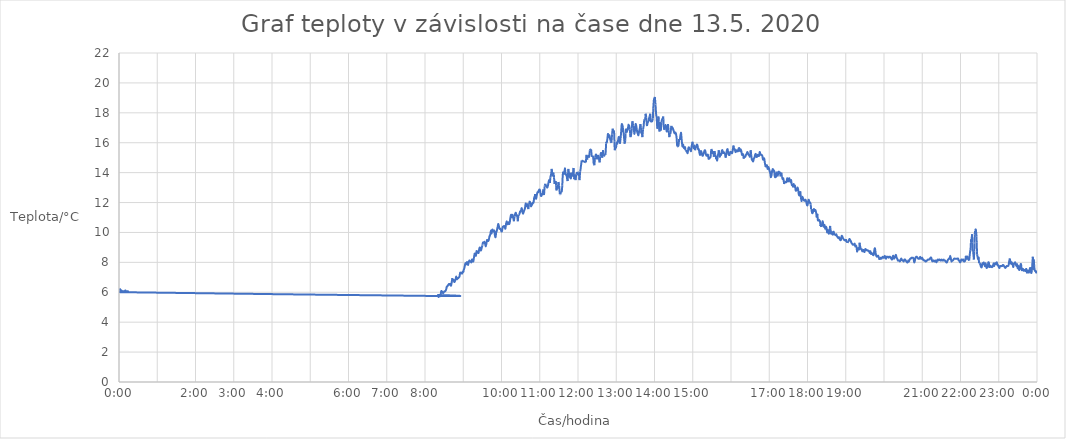
| Category | teplota/cas |
|---|---|
| 43964.00053240741 | 6.25 |
| 43964.001238425924 | 6.188 |
| 43964.00195601852 | 6.125 |
| 43964.00266203703 | 6.125 |
| 43964.00337962963 | 6.062 |
| 43964.00409722222 | 6.062 |
| 43964.00480324074 | 6.062 |
| 43964.005520833336 | 6.062 |
| 43964.00622685185 | 6.062 |
| 43964.006944444445 | 6.125 |
| 43964.00766203704 | 6 |
| 43964.008368055554 | 6.062 |
| 43964.00908564815 | 6.062 |
| 43964.009791666664 | 6.062 |
| 43964.01050925926 | 6 |
| 43964.346666666665 | 5.75 |
| 43964.34738425926 | 5.812 |
| 43964.34809027778 | 5.688 |
| 43964.348807870374 | 5.75 |
| 43964.34952546296 | 5.812 |
| 43964.35023148148 | 5.75 |
| 43964.350949074076 | 6.062 |
| 43964.35165509259 | 6.062 |
| 43964.352372685185 | 6 |
| 43964.3530787037 | 5.938 |
| 43964.353796296295 | 6 |
| 43964.35451388889 | 6.062 |
| 43964.355219907404 | 6.062 |
| 43964.3559375 | 6.125 |
| 43964.35664351852 | 6.25 |
| 43964.356990740744 | 6.375 |
| 43964.35737268518 | 6.375 |
| 43964.358090277776 | 6.438 |
| 43964.3587962963 | 6.5 |
| 43964.35951388889 | 6.562 |
| 43964.36021990741 | 6.5 |
| 43964.3609375 | 6.562 |
| 43964.361655092594 | 6.438 |
| 43964.36236111111 | 6.625 |
| 43964.363078703704 | 6.938 |
| 43964.36309027778 | 6.875 |
| 43964.36380787037 | 6.875 |
| 43964.36451388889 | 6.812 |
| 43964.36523148148 | 6.688 |
| 43964.3659375 | 6.75 |
| 43964.36665509259 | 6.875 |
| 43964.36736111111 | 7.062 |
| 43964.3680787037 | 6.875 |
| 43964.368796296294 | 6.938 |
| 43964.36950231482 | 6.938 |
| 43964.37021990741 | 7 |
| 43964.37092592593 | 7.062 |
| 43964.37164351852 | 7.312 |
| 43964.372349537036 | 7.25 |
| 43964.37306712963 | 7.312 |
| 43964.37378472222 | 7.25 |
| 43964.37449074074 | 7.375 |
| 43964.37520833333 | 7.375 |
| 43964.37547453704 | 7.5 |
| 43964.3759375 | 7.562 |
| 43964.37664351852 | 7.75 |
| 43964.37736111111 | 7.938 |
| 43964.378067129626 | 7.938 |
| 43964.37878472222 | 7.875 |
| 43964.37938657407 | 8.062 |
| 43964.37951388889 | 8 |
| 43964.380219907405 | 7.812 |
| 43964.3809375 | 8 |
| 43964.38164351852 | 8.125 |
| 43964.382361111115 | 8.062 |
| 43964.38306712963 | 8.062 |
| 43964.383784722224 | 8 |
| 43964.38450231482 | 8.188 |
| 43964.38520833333 | 8.125 |
| 43964.385925925926 | 8.062 |
| 43964.38663194444 | 8.312 |
| 43964.387349537035 | 8.562 |
| 43964.38741898148 | 8.625 |
| 43964.388078703705 | 8.625 |
| 43964.38878472222 | 8.438 |
| 43964.389502314814 | 8.75 |
| 43964.39020833333 | 8.688 |
| 43964.39092592592 | 8.688 |
| 43964.39163194445 | 8.625 |
| 43964.39234953704 | 8.875 |
| 43964.393055555556 | 9 |
| 43964.39377314815 | 8.812 |
| 43964.394479166665 | 8.812 |
| 43964.39519675926 | 9 |
| 43964.39591435185 | 9.125 |
| 43964.39592592593 | 9.188 |
| 43964.396631944444 | 9.375 |
| 43964.39734953704 | 9.312 |
| 43964.39805555555 | 9.375 |
| 43964.39877314815 | 9.25 |
| 43964.39949074074 | 9.062 |
| 43964.400196759256 | 9.25 |
| 43964.40091435185 | 9.5 |
| 43964.40162037037 | 9.438 |
| 43964.402337962965 | 9.438 |
| 43964.40304398148 | 9.562 |
| 43964.40354166667 | 9.75 |
| 43964.40377314815 | 9.75 |
| 43964.404490740744 | 9.875 |
| 43964.40519675926 | 10.125 |
| 43964.40591435185 | 9.938 |
| 43964.40662037037 | 10.188 |
| 43964.40733796296 | 10.125 |
| 43964.40804398148 | 10.062 |
| 43964.40876157407 | 10.125 |
| 43964.409467592595 | 9.812 |
| 43964.41018518519 | 9.688 |
| 43964.410891203705 | 10 |
| 43964.4116087963 | 10.125 |
| 43964.412199074075 | 10.312 |
| 43964.41233796296 | 10.312 |
| 43964.41304398148 | 10.562 |
| 43964.41376157408 | 10.438 |
| 43964.41447916667 | 10.25 |
| 43964.415185185186 | 10.25 |
| 43964.41590277778 | 10.188 |
| 43964.416608796295 | 10.062 |
| 43964.41732638889 | 10.125 |
| 43964.418032407404 | 10.375 |
| 43964.41875 | 10.375 |
| 43964.41945601852 | 10.438 |
| 43964.42017361111 | 10.375 |
| 43964.42087962963 | 10.25 |
| 43964.42159722222 | 10.562 |
| 43964.422314814816 | 10.75 |
| 43964.42302083333 | 10.562 |
| 43964.423738425925 | 10.562 |
| 43964.42444444444 | 10.688 |
| 43964.425162037034 | 10.562 |
| 43964.42586805556 | 10.75 |
| 43964.42611111111 | 10.875 |
| 43964.42659722222 | 11.062 |
| 43964.42731481481 | 11.188 |
| 43964.42802083334 | 11 |
| 43964.42873842592 | 11.188 |
| 43964.429444444446 | 11 |
| 43964.43016203704 | 10.75 |
| 43964.430868055555 | 11.062 |
| 43964.43158564815 | 11.25 |
| 43964.432291666664 | 11.312 |
| 43964.43300925926 | 11.125 |
| 43964.43371527778 | 11.125 |
| 43964.434432870374 | 10.75 |
| 43964.43513888889 | 11.188 |
| 43964.43585648148 | 11.188 |
| 43964.4365625 | 11.312 |
| 43964.43724537037 | 11.438 |
| 43964.43729166667 | 11.375 |
| 43964.43800925926 | 11.5 |
| 43964.43871527778 | 11.625 |
| 43964.43943287037 | 11.375 |
| 43964.44013888889 | 11.25 |
| 43964.44085648148 | 11.375 |
| 43964.44157407407 | 11.5 |
| 43964.44228009259 | 11.625 |
| 43964.44299768518 | 11.938 |
| 43964.443703703706 | 11.75 |
| 43964.4444212963 | 11.812 |
| 43964.445127314815 | 11.875 |
| 43964.44584490741 | 11.562 |
| 43964.446550925924 | 11.875 |
| 43964.44715277778 | 12 |
| 43964.447280092594 | 12.062 |
| 43964.44799768519 | 12 |
| 43964.4487037037 | 11.75 |
| 43964.449421296296 | 11.812 |
| 43964.45012731481 | 11.875 |
| 43964.450844907406 | 12 |
| 43964.45155092593 | 12 |
| 43964.45226851852 | 12.312 |
| 43964.45297453704 | 12.438 |
| 43964.45322916667 | 12.562 |
| 43964.4537037037 | 12.438 |
| 43964.454409722224 | 12.25 |
| 43964.45512731482 | 12.5 |
| 43964.45584490741 | 12.688 |
| 43964.45655092593 | 12.688 |
| 43964.45726851852 | 12.812 |
| 43964.457974537036 | 12.875 |
| 43964.45869212963 | 12.812 |
| 43964.459398148145 | 12.5 |
| 43964.46011574074 | 12.438 |
| 43964.46082175926 | 12.562 |
| 43964.461539351854 | 12.562 |
| 43964.46224537037 | 12.875 |
| 43964.46296296296 | 12.5 |
| 43964.46366898148 | 13.062 |
| 43964.463692129626 | 13.125 |
| 43964.46439814815 | 13.25 |
| 43964.46511574074 | 13.125 |
| 43964.46582175926 | 13.062 |
| 43964.46653935185 | 13 |
| 43964.46724537037 | 13.125 |
| 43964.46796296296 | 13.375 |
| 43964.468668981484 | 13.5 |
| 43964.46938657408 | 13.312 |
| 43964.46990740741 | 13.688 |
| 43964.47010416666 | 13.75 |
| 43964.470821759256 | 13.938 |
| 43964.47130787037 | 14.25 |
| 43964.471550925926 | 14.188 |
| 43964.47225694444 | 13.75 |
| 43964.472974537035 | 14 |
| 43964.47368055556 | 13.875 |
| 43964.47386574074 | 13.688 |
| 43964.47440972222 | 13.25 |
| 43964.475127314814 | 13.375 |
| 43964.47583333333 | 13.438 |
| 43964.476122685184 | 13.125 |
| 43964.4765625 | 12.812 |
| 43964.477268518516 | 13.062 |
| 43964.47798611111 | 12.938 |
| 43964.4787037037 | 13.375 |
| 43964.479409722226 | 13.125 |
| 43964.48012731481 | 12.625 |
| 43964.48018518519 | 12.562 |
| 43964.480844907404 | 12.562 |
| 43964.4815625 | 12.688 |
| 43964.48226851852 | 12.688 |
| 43964.48287037037 | 13.125 |
| 43964.48299768518 | 13.312 |
| 43964.48327546296 | 13.688 |
| 43964.48372685185 | 14.062 |
| 43964.48443287037 | 13.875 |
| 43964.48515046296 | 14.062 |
| 43964.48569444445 | 14.25 |
| 43964.48587962963 | 14.25 |
| 43964.48658564815 | 13.875 |
| 43964.48730324074 | 13.875 |
| 43964.48789351852 | 13.688 |
| 43964.488020833334 | 13.562 |
| 43964.48873842593 | 13.438 |
| 43964.48945601852 | 14.188 |
| 43964.48949074074 | 14.25 |
| 43964.49017361111 | 13.875 |
| 43964.490891203706 | 13.938 |
| 43964.49130787037 | 13.688 |
| 43964.4916087963 | 13.688 |
| 43964.49232638889 | 13.625 |
| 43964.49304398148 | 14 |
| 43964.49375 | 13.75 |
| 43964.494467592594 | 13.938 |
| 43964.495046296295 | 14.25 |
| 43964.49518518519 | 14.312 |
| 43964.49553240741 | 13.688 |
| 43964.49591435185 | 13.562 |
| 43964.49663194444 | 13.875 |
| 43964.49733796297 | 13.5 |
| 43964.49805555555 | 13.875 |
| 43964.498761574076 | 14 |
| 43964.49947916667 | 13.875 |
| 43964.500185185185 | 14 |
| 43964.50090277778 | 14 |
| 43964.501608796294 | 13.5 |
| 43964.50232638889 | 14.062 |
| 43964.502847222226 | 14.25 |
| 43964.50305555556 | 14.375 |
| 43964.50376157407 | 14.688 |
| 43964.503900462965 | 14.812 |
| 43964.50854166667 | 14.688 |
| 43964.50925925926 | 15.188 |
| 43964.50997685185 | 14.875 |
| 43964.51068287037 | 15.125 |
| 43964.511400462965 | 15.125 |
| 43964.51210648148 | 15.062 |
| 43964.512824074074 | 15.438 |
| 43964.51288194444 | 15.5 |
| 43964.51354166667 | 15.562 |
| 43964.51425925926 | 15.562 |
| 43964.514965277776 | 15.062 |
| 43964.51568287037 | 15.125 |
| 43964.516388888886 | 15.062 |
| 43964.51667824074 | 14.938 |
| 43964.517118055555 | 14.562 |
| 43964.51783564815 | 14.5 |
| 43964.518541666665 | 15 |
| 43964.51925925926 | 15.188 |
| 43964.51996527778 | 15.188 |
| 43964.520682870374 | 14.938 |
| 43964.52138888889 | 15.062 |
| 43964.52210648148 | 15.125 |
| 43964.5228125 | 14.938 |
| 43964.52353009259 | 14.688 |
| 43964.52423611111 | 15.062 |
| 43964.5249537037 | 15.312 |
| 43964.525659722225 | 15.25 |
| 43964.52637731482 | 15 |
| 43964.527083333334 | 15.375 |
| 43964.52731481481 | 15.5 |
| 43964.5278125 | 15.188 |
| 43964.52853009259 | 15.125 |
| 43964.52923611111 | 15.188 |
| 43964.529953703706 | 15.188 |
| 43964.53065972222 | 15.938 |
| 43964.53076388889 | 16.062 |
| 43964.53138888889 | 16 |
| 43964.53209490741 | 16.312 |
| 43964.53265046296 | 16.625 |
| 43964.53282407407 | 16.562 |
| 43964.533541666664 | 16.375 |
| 43964.53424768519 | 16.5 |
| 43964.53496527778 | 16.25 |
| 43964.5356712963 | 16.125 |
| 43964.53574074074 | 16.062 |
| 43964.53640046297 | 16 |
| 43964.53710648148 | 16.562 |
| 43964.53712962963 | 16.625 |
| 43964.537835648145 | 16.938 |
| 43964.53855324074 | 16.625 |
| 43964.53925925926 | 16.812 |
| 43964.53971064815 | 16.062 |
| 43964.539988425924 | 15.562 |
| 43964.54 | 15.5 |
| 43964.540717592594 | 15.688 |
| 43964.54142361111 | 15.688 |
| 43964.5421412037 | 16 |
| 43964.54284722222 | 15.938 |
| 43964.54313657407 | 16.062 |
| 43964.54357638889 | 16.125 |
| 43964.544282407405 | 16.375 |
| 43964.545 | 16.312 |
| 43964.54570601852 | 15.938 |
| 43964.546423611115 | 16.312 |
| 43964.546875 | 16.625 |
| 43964.54715277778 | 16.875 |
| 43964.54756944445 | 17.188 |
| 43964.54787037037 | 17.25 |
| 43964.54858796296 | 17.125 |
| 43964.54929398148 | 16.75 |
| 43964.549791666665 | 16.625 |
| 43964.55002314815 | 16.438 |
| 43964.55056712963 | 16.062 |
| 43964.55075231481 | 15.938 |
| 43964.551469907405 | 16.125 |
| 43964.551875 | 16.625 |
| 43964.5521875 | 16.938 |
| 43964.55290509259 | 16.688 |
| 43964.553611111114 | 16.812 |
| 43964.55432870371 | 16.938 |
| 43964.55496527778 | 17.188 |
| 43964.55505787037 | 17.188 |
| 43964.555763888886 | 17.125 |
| 43964.55648148148 | 16.875 |
| 43964.556608796294 | 16.625 |
| 43964.55719907407 | 16.375 |
| 43964.557916666665 | 16.562 |
| 43964.55862268519 | 16.938 |
| 43964.55876157407 | 17.188 |
| 43964.55935185185 | 17.438 |
| 43964.56005787037 | 17.125 |
| 43964.56077546296 | 16.938 |
| 43964.56130787037 | 16.625 |
| 43964.56150462963 | 16.625 |
| 43964.562210648146 | 16.875 |
| 43964.562627314815 | 17.188 |
| 43964.562939814816 | 17.25 |
| 43964.56364583333 | 17.062 |
| 43964.564363425925 | 16.75 |
| 43964.56501157407 | 16.625 |
| 43964.565092592595 | 16.625 |
| 43964.56579861111 | 16.5 |
| 43964.566516203704 | 16.75 |
| 43964.56722222222 | 16.938 |
| 43964.567881944444 | 17.188 |
| 43964.56795138889 | 17.25 |
| 43964.568657407406 | 17 |
| 43964.569027777776 | 16.625 |
| 43964.569386574076 | 16.812 |
| 43964.57010416667 | 16.375 |
| 43964.570810185185 | 16.875 |
| 43964.57152777778 | 17.125 |
| 43964.57157407407 | 17.188 |
| 43964.57224537037 | 17.562 |
| 43964.572962962964 | 17.562 |
| 43964.573541666665 | 17.75 |
| 43964.57369212963 | 17.938 |
| 43964.57439814815 | 17.688 |
| 43964.575 | 17.188 |
| 43964.57512731481 | 17.125 |
| 43964.575844907406 | 17.312 |
| 43964.57655092593 | 17.438 |
| 43964.57726851852 | 17.438 |
| 43964.57759259259 | 17.75 |
| 43964.57798611111 | 17.75 |
| 43964.5787037037 | 17.938 |
| 43964.579409722224 | 17.375 |
| 43964.58012731482 | 17.5 |
| 43964.58083333333 | 17.438 |
| 43964.58155092593 | 17.625 |
| 43964.58201388889 | 18.312 |
| 43964.58226851852 | 18.562 |
| 43964.58269675926 | 18.875 |
| 43964.58299768518 | 18.938 |
| 43964.583715277775 | 19.062 |
| 43964.5844212963 | 18.562 |
| 43964.58467592593 | 18.312 |
| 43964.58515046296 | 17.875 |
| 43964.58557870371 | 17.75 |
| 43964.58587962963 | 17.5 |
| 43964.58611111111 | 17.188 |
| 43964.58660879629 | 16.938 |
| 43964.58731481482 | 17.625 |
| 43964.58773148148 | 17.75 |
| 43964.58804398148 | 17.438 |
| 43964.58824074074 | 17.188 |
| 43964.58877314815 | 16.75 |
| 43964.589479166665 | 17.375 |
| 43964.59019675926 | 16.812 |
| 43964.590902777774 | 17.375 |
| 43964.59162037037 | 17.562 |
| 43964.59232638889 | 17.625 |
| 43964.59278935185 | 17.75 |
| 43964.59305555555 | 17.562 |
| 43964.59327546296 | 17.188 |
| 43964.593773148146 | 16.875 |
| 43964.59449074074 | 16.938 |
| 43964.59519675926 | 17.188 |
| 43964.59591435185 | 17 |
| 43964.59662037037 | 16.75 |
| 43964.597337962965 | 16.875 |
| 43964.59804398148 | 17.25 |
| 43964.598761574074 | 16.812 |
| 43964.59903935185 | 16.625 |
| 43964.599490740744 | 16.375 |
| 43964.60019675926 | 16.562 |
| 43964.60091435185 | 16.688 |
| 43964.60162037037 | 17.125 |
| 43964.60233796296 | 17 |
| 43964.60304398148 | 17 |
| 43964.60376157407 | 16.875 |
| 43964.604467592595 | 16.75 |
| 43964.60518518519 | 16.625 |
| 43964.605891203704 | 16.688 |
| 43964.6066087963 | 16.625 |
| 43964.60731481481 | 16.375 |
| 43964.607719907406 | 16.062 |
| 43964.60804398148 | 15.75 |
| 43964.60875 | 15.75 |
| 43964.60946759259 | 15.812 |
| 43964.61017361111 | 16.25 |
| 43964.6108912037 | 16.188 |
| 43964.611597222225 | 16.5 |
| 43964.61210648148 | 16.625 |
| 43964.61232638889 | 16.625 |
| 43964.61304398148 | 16.125 |
| 43964.61315972222 | 16.062 |
| 43964.61376157407 | 15.75 |
| 43964.61447916667 | 15.875 |
| 43964.61518518518 | 15.688 |
| 43964.615902777776 | 15.625 |
| 43964.6166087963 | 15.75 |
| 43964.61690972222 | 15.5 |
| 43964.61733796296 | 15.5 |
| 43964.618055555555 | 15.438 |
| 43964.61876157407 | 15.375 |
| 43964.619479166664 | 15.312 |
| 43964.62018518519 | 15.625 |
| 43964.62090277778 | 15.688 |
| 43964.6216087963 | 15.562 |
| 43964.62232638889 | 15.562 |
| 43964.623032407406 | 15.438 |
| 43964.62375 | 15.75 |
| 43964.624456018515 | 15.938 |
| 43964.62469907408 | 16.062 |
| 43964.625185185185 | 15.812 |
| 43964.62590277778 | 15.625 |
| 43964.626608796294 | 15.812 |
| 43964.62732638889 | 15.688 |
| 43964.627604166664 | 15.5 |
| 43964.62804398148 | 15.625 |
| 43964.62876157407 | 15.75 |
| 43964.62946759259 | 15.875 |
| 43964.63018518518 | 15.812 |
| 43964.630891203706 | 15.562 |
| 43964.6316087963 | 15.562 |
| 43964.632314814815 | 15.312 |
| 43964.63303240741 | 15.188 |
| 43964.633738425924 | 15.438 |
| 43964.63445601852 | 15.375 |
| 43964.63516203704 | 15.188 |
| 43964.635879629626 | 15.125 |
| 43964.63659722222 | 15.25 |
| 43964.63730324074 | 15.375 |
| 43964.638020833336 | 15.5 |
| 43964.63872685185 | 15.438 |
| 43964.639444444445 | 15.188 |
| 43964.64015046296 | 15.125 |
| 43964.640868055554 | 15.188 |
| 43964.64157407408 | 15.188 |
| 43964.6421875 | 14.938 |
| 43964.64230324074 | 14.938 |
| 43964.643009259256 | 14.938 |
| 43964.64372685185 | 15 |
| 43964.64443287037 | 15.062 |
| 43964.64509259259 | 15.5 |
| 43964.645162037035 | 15.562 |
| 43964.64587962963 | 15.5 |
| 43964.646585648145 | 15.312 |
| 43964.64730324074 | 15.375 |
| 43964.64800925926 | 15.062 |
| 43964.648726851854 | 15.438 |
| 43964.64943287037 | 15.188 |
| 43964.65015046296 | 15.062 |
| 43964.65037037037 | 14.938 |
| 43964.650868055556 | 15 |
| 43964.65158564815 | 14.812 |
| 43964.65230324074 | 15.125 |
| 43964.65300925926 | 15.312 |
| 43964.65331018518 | 15.5 |
| 43964.65373842593 | 15.312 |
| 43964.654444444444 | 15.062 |
| 43964.65516203704 | 15.25 |
| 43964.65586805555 | 15.188 |
| 43964.65658564815 | 15.438 |
| 43964.65729166667 | 15.5 |
| 43964.658009259256 | 15.312 |
| 43964.65871527778 | 15.375 |
| 43964.65943287037 | 15.312 |
| 43964.660150462965 | 15.25 |
| 43964.66085648148 | 15 |
| 43964.661574074074 | 15.312 |
| 43964.66228009259 | 15.5 |
| 43964.662997685184 | 15.562 |
| 43964.66370370371 | 15.25 |
| 43964.66442129629 | 15.188 |
| 43964.665127314816 | 15.188 |
| 43964.66584490741 | 15.375 |
| 43964.666550925926 | 15.375 |
| 43964.66726851852 | 15.312 |
| 43964.667974537035 | 15.312 |
| 43964.66869212963 | 15.562 |
| 43964.66939814815 | 15.812 |
| 43964.670115740744 | 15.5 |
| 43964.67082175926 | 15.562 |
| 43964.67153935185 | 15.375 |
| 43964.67224537037 | 15.438 |
| 43964.67296296296 | 15.5 |
| 43964.67366898148 | 15.438 |
| 43964.67438657407 | 15.438 |
| 43964.675092592595 | 15.625 |
| 43964.67581018519 | 15.625 |
| 43964.676516203705 | 15.438 |
| 43964.6772337963 | 15.562 |
| 43964.677939814814 | 15.438 |
| 43964.67865740741 | 15.188 |
| 43964.67936342592 | 15.25 |
| 43964.680081018516 | 15.188 |
| 43964.68052083333 | 14.938 |
| 43964.680810185186 | 15.062 |
| 43964.6815162037 | 15.062 |
| 43964.682233796295 | 15.062 |
| 43964.68293981482 | 15.188 |
| 43964.683657407404 | 15.25 |
| 43964.68436342593 | 15.375 |
| 43964.68508101852 | 15.312 |
| 43964.68578703704 | 15.188 |
| 43964.68650462963 | 15.188 |
| 43964.687210648146 | 15.062 |
| 43964.68792824074 | 15.25 |
| 43964.68809027778 | 15.5 |
| 43964.68865740741 | 15.188 |
| 43964.68918981482 | 14.938 |
| 43964.689375 | 14.875 |
| 43964.690092592595 | 14.812 |
| 43964.69079861111 | 14.75 |
| 43964.691516203704 | 14.938 |
| 43964.69222222222 | 15 |
| 43964.69293981481 | 15.188 |
| 43964.693657407406 | 15.25 |
| 43964.69436342592 | 15.062 |
| 43964.695081018515 | 15.062 |
| 43964.69578703704 | 15.188 |
| 43964.69650462963 | 15.125 |
| 43964.69721064815 | 15.125 |
| 43964.69792824074 | 15.375 |
| 43964.69863425926 | 15.25 |
| 43964.69935185185 | 15.188 |
| 43964.700057870374 | 15.188 |
| 43964.70077546296 | 15.125 |
| 43964.70148148148 | 14.875 |
| 43964.702199074076 | 14.938 |
| 43964.70290509259 | 14.938 |
| 43964.703622685185 | 14.625 |
| 43964.7043287037 | 14.438 |
| 43964.704375 | 14.375 |
| 43964.70505787037 | 14.375 |
| 43964.705775462964 | 14.5 |
| 43964.70648148148 | 14.25 |
| 43964.70719907407 | 14.375 |
| 43964.70790509259 | 14.312 |
| 43964.70862268518 | 14.125 |
| 43964.709328703706 | 14 |
| 43964.709814814814 | 13.812 |
| 43964.71005787037 | 13.688 |
| 43964.71077546296 | 13.812 |
| 43964.711481481485 | 14.125 |
| 43964.71219907407 | 14.25 |
| 43964.712905092594 | 14.125 |
| 43964.71362268519 | 14.125 |
| 43964.7143287037 | 13.75 |
| 43964.715046296296 | 13.688 |
| 43964.71575231481 | 13.75 |
| 43964.716469907406 | 14.062 |
| 43964.71717592593 | 13.75 |
| 43964.71789351852 | 13.875 |
| 43964.71859953704 | 14.062 |
| 43964.71931712963 | 14 |
| 43964.72002314815 | 14 |
| 43964.72074074074 | 13.75 |
| 43964.72144675926 | 14 |
| 43964.72216435185 | 13.75 |
| 43964.72287037037 | 13.562 |
| 43964.723587962966 | 13.625 |
| 43964.72429398148 | 13.375 |
| 43964.72447916667 | 13.25 |
| 43964.725023148145 | 13.312 |
| 43964.72574074074 | 13.375 |
| 43964.72644675926 | 13.375 |
| 43964.727164351854 | 13.375 |
| 43964.72787037037 | 13.625 |
| 43964.72858796296 | 13.438 |
| 43964.72929398148 | 13.438 |
| 43964.73001157407 | 13.625 |
| 43964.730717592596 | 13.5 |
| 43964.73143518518 | 13.375 |
| 43964.732141203705 | 13.5 |
| 43964.7328587963 | 13.188 |
| 43964.73357638889 | 13.188 |
| 43964.73428240741 | 13.062 |
| 43964.735 | 13.25 |
| 43964.73570601852 | 13.062 |
| 43964.73642361111 | 13.125 |
| 43964.737129629626 | 12.812 |
| 43964.73784722222 | 12.812 |
| 43964.73855324074 | 12.875 |
| 43964.739270833335 | 13 |
| 43964.73997685185 | 12.812 |
| 43964.74016203704 | 12.688 |
| 43964.74070601852 | 12.5 |
| 43964.741423611114 | 12.5 |
| 43964.74212962963 | 12.75 |
| 43964.742847222224 | 12.312 |
| 43964.74344907407 | 12.125 |
| 43964.74356481482 | 12.125 |
| 43964.74428240741 | 12.375 |
| 43964.744988425926 | 12.312 |
| 43964.74570601852 | 12.188 |
| 43964.74642361111 | 12.125 |
| 43964.74712962963 | 12.125 |
| 43964.74784722222 | 12.188 |
| 43964.74855324074 | 12.062 |
| 43964.74927083333 | 11.875 |
| 43964.749976851854 | 11.812 |
| 43964.75069444445 | 12.062 |
| 43964.75140046296 | 12.188 |
| 43964.752118055556 | 12 |
| 43964.75282407407 | 12 |
| 43964.753541666665 | 11.875 |
| 43964.75387731481 | 11.562 |
| 43964.754270833335 | 11.562 |
| 43964.75497685185 | 11.312 |
| 43964.755694444444 | 11.312 |
| 43964.75640046296 | 11.5 |
| 43964.75711805555 | 11.562 |
| 43964.75782407408 | 11.438 |
| 43964.75854166667 | 11.5 |
| 43964.759247685186 | 11.375 |
| 43964.75996527778 | 11.062 |
| 43964.76002314815 | 11 |
| 43964.76069444444 | 11.25 |
| 43964.761400462965 | 10.75 |
| 43964.76211805556 | 10.875 |
| 43964.762824074074 | 10.812 |
| 43964.76354166667 | 10.75 |
| 43964.76424768518 | 10.438 |
| 43964.76427083334 | 10.5 |
| 43964.76497685185 | 10.375 |
| 43964.765694444446 | 10.5 |
| 43964.76640046296 | 10.75 |
| 43964.767118055555 | 10.562 |
| 43964.76782407407 | 10.375 |
| 43964.768541666665 | 10.5 |
| 43964.76924768519 | 10.25 |
| 43964.76996527778 | 10.375 |
| 43964.7706712963 | 10.312 |
| 43964.77138888889 | 10 |
| 43964.77209490741 | 10.188 |
| 43964.7728125 | 10 |
| 43964.773506944446 | 9.875 |
| 43964.77354166667 | 9.938 |
| 43964.774247685185 | 10.25 |
| 43964.77462962963 | 10.438 |
| 43964.774976851855 | 10.25 |
| 43964.77569444444 | 9.938 |
| 43964.77578703704 | 9.875 |
| 43964.776412037034 | 10.062 |
| 43964.77712962963 | 9.875 |
| 43964.77783564815 | 9.875 |
| 43964.77855324074 | 10.062 |
| 43964.77925925926 | 9.875 |
| 43964.77997685185 | 9.875 |
| 43964.780694444446 | 9.812 |
| 43964.78140046296 | 9.875 |
| 43964.782118055555 | 9.75 |
| 43964.78282407407 | 9.688 |
| 43964.783541666664 | 9.625 |
| 43964.78424768519 | 9.688 |
| 43964.78496527778 | 9.562 |
| 43964.7856712963 | 9.5 |
| 43964.78638888889 | 9.5 |
| 43964.78710648148 | 9.75 |
| 43964.7878125 | 9.75 |
| 43964.78853009259 | 9.625 |
| 43964.78923611111 | 9.562 |
| 43964.7899537037 | 9.5 |
| 43964.790659722225 | 9.5 |
| 43964.79137731482 | 9.438 |
| 43964.792083333334 | 9.5 |
| 43964.79280092593 | 9.375 |
| 43964.79350694444 | 9.375 |
| 43964.793541666666 | 9.312 |
| 43964.79423611111 | 9.375 |
| 43964.794953703706 | 9.438 |
| 43964.79565972222 | 9.562 |
| 43964.796377314815 | 9.5 |
| 43964.79708333333 | 9.438 |
| 43964.797800925924 | 9.312 |
| 43964.79851851852 | 9.25 |
| 43964.79922453704 | 9.188 |
| 43964.799942129626 | 9.188 |
| 43964.80064814815 | 9.188 |
| 43964.80136574074 | 9.25 |
| 43964.80207175926 | 9.062 |
| 43964.80278935185 | 9.125 |
| 43964.80349537037 | 9 |
| 43964.803935185184 | 8.75 |
| 43964.80422453704 | 8.75 |
| 43964.80494212963 | 8.938 |
| 43964.80564814815 | 8.938 |
| 43964.80636574074 | 8.812 |
| 43964.80673611111 | 9.312 |
| 43964.80709490741 | 9.188 |
| 43964.807800925926 | 8.938 |
| 43964.80851851852 | 8.875 |
| 43964.809224537035 | 8.875 |
| 43964.80954861111 | 8.75 |
| 43964.809953703705 | 8.75 |
| 43964.8106712963 | 8.812 |
| 43964.811377314814 | 8.812 |
| 43964.81209490741 | 8.688 |
| 43964.81280092592 | 8.875 |
| 43964.81351851852 | 8.875 |
| 43964.81423611111 | 8.812 |
| 43964.81494212963 | 8.812 |
| 43964.81565972222 | 8.812 |
| 43964.81636574074 | 8.75 |
| 43964.817083333335 | 8.75 |
| 43964.81778935185 | 8.625 |
| 43964.818506944444 | 8.75 |
| 43964.81921296296 | 8.562 |
| 43964.81993055555 | 8.625 |
| 43964.82064814815 | 8.562 |
| 43964.82135416667 | 8.5 |
| 43964.822071759256 | 8.5 |
| 43964.82277777778 | 8.812 |
| 43964.82349537037 | 8.938 |
| 43964.82420138889 | 8.625 |
| 43964.82491898148 | 8.438 |
| 43964.825636574074 | 8.375 |
| 43964.82634259259 | 8.438 |
| 43964.827060185184 | 8.438 |
| 43964.82776620371 | 8.312 |
| 43964.8284375 | 8.188 |
| 43964.82849537037 | 8.25 |
| 43964.82921296296 | 8.188 |
| 43964.82991898148 | 8.312 |
| 43964.83063657407 | 8.25 |
| 43964.831342592595 | 8.312 |
| 43964.83206018519 | 8.375 |
| 43964.832766203705 | 8.312 |
| 43964.8334837963 | 8.312 |
| 43964.83420138889 | 8.438 |
| 43964.83490740741 | 8.312 |
| 43964.835625 | 8.25 |
| 43964.836331018516 | 8.375 |
| 43964.83704861111 | 8.375 |
| 43964.83775462963 | 8.375 |
| 43964.838472222225 | 8.312 |
| 43964.83918981482 | 8.375 |
| 43964.839895833335 | 8.375 |
| 43964.84061342593 | 8.312 |
| 43964.841319444444 | 8.25 |
| 43964.84203703704 | 8.188 |
| 43964.84274305555 | 8.375 |
| 43964.843460648146 | 8.438 |
| 43964.84417824074 | 8.25 |
| 43964.84488425926 | 8.312 |
| 43964.845601851855 | 8.375 |
| 43964.84630787037 | 8.5 |
| 43964.847025462965 | 8.312 |
| 43964.84773148148 | 8.25 |
| 43964.848449074074 | 8.125 |
| 43964.84915509259 | 8.125 |
| 43964.84987268518 | 8.125 |
| 43964.850590277776 | 8.062 |
| 43964.8512962963 | 8.125 |
| 43964.852013888885 | 8.25 |
| 43964.85271990741 | 8.188 |
| 43964.8534375 | 8.125 |
| 43964.85414351852 | 8.125 |
| 43964.85486111111 | 8.062 |
| 43964.855578703704 | 8.188 |
| 43964.85628472222 | 8.188 |
| 43964.85700231481 | 8.125 |
| 43964.85770833334 | 8.062 |
| 43964.85842592592 | 8 |
| 43964.859143518515 | 8 |
| 43964.85984953704 | 8.125 |
| 43964.86056712963 | 8.062 |
| 43964.86127314815 | 8.188 |
| 43964.86199074074 | 8.25 |
| 43964.86269675926 | 8.25 |
| 43964.86341435185 | 8.312 |
| 43964.864120370374 | 8.312 |
| 43964.86483796296 | 8.312 |
| 43964.86555555555 | 8.25 |
| 43964.866261574076 | 8 |
| 43964.86697916667 | 8.125 |
| 43964.867685185185 | 8.312 |
| 43964.86840277778 | 8.375 |
| 43964.869108796294 | 8.375 |
| 43964.86982638889 | 8.312 |
| 43964.87054398148 | 8.25 |
| 43964.87125 | 8.25 |
| 43964.87196759259 | 8.25 |
| 43964.87267361111 | 8.375 |
| 43964.873391203706 | 8.25 |
| 43964.87409722222 | 8.25 |
| 43964.874814814815 | 8.312 |
| 43964.87552083333 | 8.188 |
| 43964.876238425924 | 8.188 |
| 43964.87695601852 | 8.125 |
| 43964.87766203703 | 8.125 |
| 43964.87837962963 | 8.062 |
| 43964.87908564815 | 8.062 |
| 43964.87980324074 | 8.125 |
| 43964.88050925926 | 8.125 |
| 43964.88122685185 | 8.188 |
| 43964.881944444445 | 8.188 |
| 43964.88265046296 | 8.188 |
| 43964.883368055554 | 8.25 |
| 43964.88407407407 | 8.312 |
| 43964.884791666664 | 8.312 |
| 43964.88549768519 | 8.125 |
| 43964.88621527778 | 8.062 |
| 43964.886921296296 | 8.125 |
| 43964.88763888889 | 8.125 |
| 43964.88835648148 | 8.062 |
| 43964.8890625 | 8.062 |
| 43964.88978009259 | 8.125 |
| 43964.89048611111 | 8 |
| 43964.8912037037 | 8.125 |
| 43964.891909722224 | 8.188 |
| 43964.89262731482 | 8.125 |
| 43964.89334490741 | 8.188 |
| 43964.89405092593 | 8.188 |
| 43964.89476851852 | 8.125 |
| 43964.895474537036 | 8.125 |
| 43964.89619212963 | 8.188 |
| 43964.896898148145 | 8.125 |
| 43964.89761574074 | 8.125 |
| 43964.89832175926 | 8.188 |
| 43964.899039351854 | 8.125 |
| 43964.89975694445 | 8.125 |
| 43964.90046296296 | 8.062 |
| 43964.90118055556 | 8 |
| 43964.90188657407 | 8 |
| 43964.902604166666 | 8.125 |
| 43964.90331018518 | 8.188 |
| 43964.904027777775 | 8.25 |
| 43964.90474537037 | 8.25 |
| 43964.90545138889 | 8.438 |
| 43964.906168981484 | 8.25 |
| 43964.906875 | 8.062 |
| 43964.90759259259 | 8.125 |
| 43964.90829861111 | 8.125 |
| 43964.9090162037 | 8.188 |
| 43964.90972222222 | 8.25 |
| 43964.91043981481 | 8.25 |
| 43964.911157407405 | 8.25 |
| 43964.91186342593 | 8.25 |
| 43964.91258101852 | 8.25 |
| 43964.91328703704 | 8.25 |
| 43964.91400462963 | 8.25 |
| 43964.91471064815 | 8.125 |
| 43964.91542824074 | 8.125 |
| 43964.91614583333 | 8 |
| 43964.91685185185 | 8.062 |
| 43964.91756944444 | 8.188 |
| 43964.918275462966 | 8.188 |
| 43964.91899305556 | 8.125 |
| 43964.919699074075 | 8.188 |
| 43964.92041666667 | 8.062 |
| 43964.92113425926 | 8.062 |
| 43964.92184027778 | 8.125 |
| 43964.92255787037 | 8.438 |
| 43964.923263888886 | 8.188 |
| 43964.92398148148 | 8.438 |
| 43964.9246875 | 8.312 |
| 43964.925405092596 | 8.188 |
| 43964.92612268519 | 8.125 |
| 43964.926828703705 | 8.562 |
| 43964.92722222222 | 8.75 |
| 43964.92755787037 | 8.812 |
| 43964.92799768518 | 9.312 |
| 43964.92828703704 | 9.562 |
| 43964.92899305555 | 9.625 |
| 43964.92916666667 | 9.875 |
| 43964.92952546296 | 9.312 |
| 43964.9297337963 | 9 |
| 43964.92990740741 | 8.75 |
| 43964.93046296296 | 8.688 |
| 43964.931180555555 | 8.25 |
| 43964.9312037037 | 8.188 |
| 43964.93173611111 | 8.75 |
| 43964.931921296295 | 9.25 |
| 43964.93193287037 | 9.312 |
| 43964.932118055556 | 9.875 |
| 43964.932662037034 | 10.125 |
| 43964.93336805556 | 10.188 |
| 43964.93408564815 | 9.75 |
| 43964.93430555556 | 9.312 |
| 43964.93460648148 | 8.75 |
| 43964.93482638889 | 8.5 |
| 43964.93554398148 | 8.312 |
| 43964.9356712963 | 8.188 |
| 43964.936261574076 | 8.375 |
| 43964.93697916667 | 7.938 |
| 43964.93769675926 | 7.938 |
| 43964.93840277778 | 7.812 |
| 43964.93912037037 | 7.688 |
| 43964.93982638889 | 7.688 |
| 43964.94054398148 | 7.938 |
| 43964.94125 | 7.875 |
| 43964.94196759259 | 8 |
| 43964.94267361111 | 7.875 |
| 43964.943391203706 | 7.75 |
| 43964.9441087963 | 7.938 |
| 43964.944814814815 | 7.688 |
| 43964.9452662037 | 7.625 |
| 43964.945543981485 | 7.75 |
| 43964.94626157408 | 7.688 |
| 43964.946967592594 | 8 |
| 43964.94768518519 | 7.938 |
| 43964.9483912037 | 7.688 |
| 43964.949108796296 | 7.75 |
| 43964.94981481481 | 7.75 |
| 43964.950532407405 | 7.688 |
| 43964.95125 | 7.688 |
| 43964.95195601852 | 7.75 |
| 43964.952673611115 | 7.938 |
| 43964.95337962963 | 7.75 |
| 43964.954097222224 | 7.938 |
| 43964.95480324074 | 7.875 |
| 43964.95552083333 | 7.938 |
| 43964.956238425926 | 8 |
| 43964.95694444444 | 7.812 |
| 43964.957662037035 | 7.812 |
| 43964.95836805556 | 7.688 |
| 43964.959085648145 | 7.625 |
| 43964.95979166667 | 7.75 |
| 43964.96050925926 | 7.75 |
| 43964.961226851854 | 7.75 |
| 43964.96193287037 | 7.75 |
| 43964.96265046296 | 7.812 |
| 43964.96335648148 | 7.812 |
| 43964.96407407407 | 7.75 |
| 43964.964780092596 | 7.688 |
| 43964.96549768518 | 7.625 |
| 43964.966215277775 | 7.688 |
| 43964.9669212963 | 7.75 |
| 43964.96763888889 | 7.75 |
| 43964.96834490741 | 7.75 |
| 43964.9690625 | 7.812 |
| 43964.96976851852 | 8.125 |
| 43964.96979166667 | 8.188 |
| 43964.970497685186 | 8.25 |
| 43964.97121527778 | 7.875 |
| 43964.971921296295 | 8.062 |
| 43964.97263888889 | 7.875 |
| 43964.973344907405 | 7.938 |
| 43964.9740625 | 7.688 |
| 43964.97478009259 | 7.875 |
| 43964.975486111114 | 7.938 |
| 43964.97620370371 | 8 |
| 43964.97690972222 | 7.875 |
| 43964.977627314816 | 7.75 |
| 43964.97833333333 | 7.875 |
| 43964.97888888889 | 7.625 |
| 43964.9790625 | 7.625 |
| 43964.979780092595 | 7.75 |
| 43964.98048611111 | 7.5 |
| 43964.981203703705 | 7.562 |
| 43964.98190972222 | 7.812 |
| 43964.982627314814 | 7.875 |
| 43964.98334490741 | 7.5 |
| 43964.98405092592 | 7.5 |
| 43964.984768518516 | 7.562 |
| 43964.98547453704 | 7.438 |
| 43964.98619212963 | 7.5 |
| 43964.98689814815 | 7.438 |
| 43964.98761574074 | 7.438 |
| 43964.988333333335 | 7.562 |
| 43964.98903935185 | 7.312 |
| 43964.989756944444 | 7.438 |
| 43964.99046296296 | 7.438 |
| 43964.99118055555 | 7.312 |
| 43964.99188657408 | 7.5 |
| 43964.99260416667 | 7.625 |
| 43964.99332175926 | 7.375 |
| 43964.99402777778 | 7.312 |
| 43964.99474537037 | 7.75 |
| 43964.99524305556 | 8.188 |
| 43964.995462962965 | 8.375 |
| 43964.99601851852 | 7.625 |
| 43964.99619212963 | 7.5 |
| 43964.996400462966 | 8.188 |
| 43964.9969212963 | 7.812 |
| 43964.99716435185 | 7.625 |
| 43964.99765046296 | 7.438 |
| 43964.99835648148 | 7.438 |
| 43964.999074074076 | 7.312 |
| 43964.99979166667 | 7.438 |